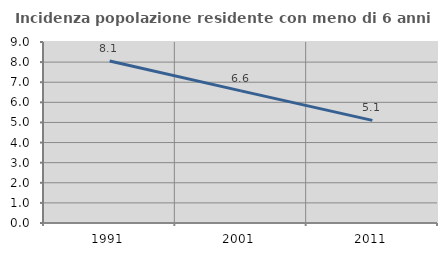
| Category | Incidenza popolazione residente con meno di 6 anni |
|---|---|
| 1991.0 | 8.056 |
| 2001.0 | 6.569 |
| 2011.0 | 5.104 |